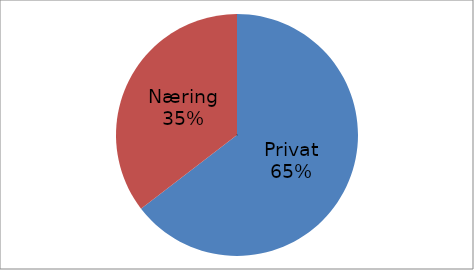
| Category | Series 0 |
|---|---|
| Privat | 40103339 |
| Næring | 21993576 |